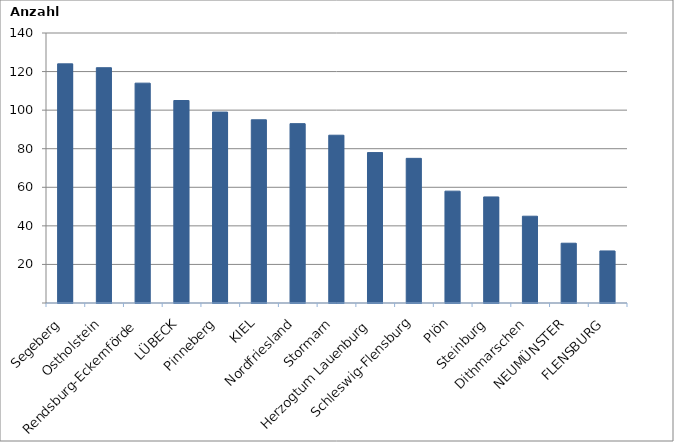
| Category | Series 0 |
|---|---|
| Segeberg | 124 |
| Ostholstein | 122 |
| Rendsburg-Eckernförde | 114 |
| LÜBECK | 105 |
| Pinneberg | 99 |
| KIEL | 95 |
| Nordfriesland | 93 |
| Stormarn | 87 |
| Herzogtum Lauenburg | 78 |
| Schleswig-Flensburg | 75 |
| Plön | 58 |
| Steinburg | 55 |
| Dithmarschen | 45 |
| NEUMÜNSTER | 31 |
| FLENSBURG | 27 |